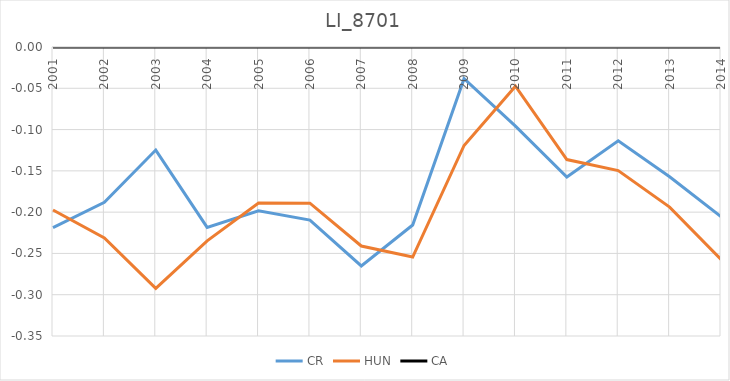
| Category | CR | HUN | CA |
|---|---|---|---|
| 2001.0 | -0.219 | -0.197 | 0 |
| 2002.0 | -0.188 | -0.231 | 0 |
| 2003.0 | -0.125 | -0.292 | 0 |
| 2004.0 | -0.218 | -0.235 | 0 |
| 2005.0 | -0.198 | -0.189 | 0 |
| 2006.0 | -0.21 | -0.189 | 0 |
| 2007.0 | -0.265 | -0.241 | 0 |
| 2008.0 | -0.216 | -0.254 | 0 |
| 2009.0 | -0.038 | -0.119 | 0 |
| 2010.0 | -0.096 | -0.047 | 0 |
| 2011.0 | -0.158 | -0.136 | 0 |
| 2012.0 | -0.114 | -0.15 | 0 |
| 2013.0 | -0.157 | -0.194 | 0 |
| 2014.0 | -0.206 | -0.257 | 0 |